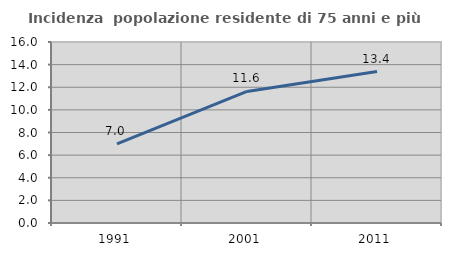
| Category | Incidenza  popolazione residente di 75 anni e più |
|---|---|
| 1991.0 | 6.992 |
| 2001.0 | 11.631 |
| 2011.0 | 13.392 |